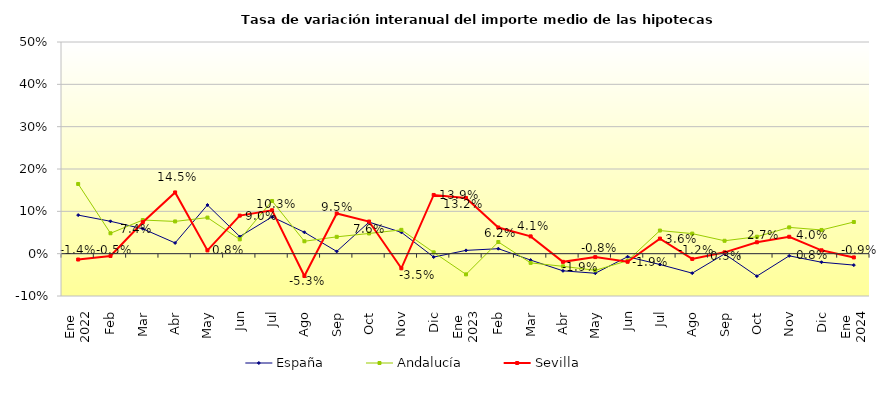
| Category | España | Andalucía | Sevilla |
|---|---|---|---|
| 0 | 0.091 | 0.165 | -0.014 |
| 1 | 0.076 | 0.048 | -0.005 |
| 2 | 0.059 | 0.079 | 0.074 |
| 3 | 0.025 | 0.076 | 0.145 |
| 4 | 0.115 | 0.085 | 0.008 |
| 5 | 0.04 | 0.034 | 0.09 |
| 6 | 0.087 | 0.124 | 0.103 |
| 7 | 0.051 | 0.029 | -0.053 |
| 8 | 0.005 | 0.04 | 0.095 |
| 9 | 0.074 | 0.048 | 0.076 |
| 10 | 0.051 | 0.056 | -0.035 |
| 11 | -0.008 | 0.003 | 0.139 |
| 12 | 0.008 | -0.049 | 0.132 |
| 13 | 0.012 | 0.028 | 0.062 |
| 14 | -0.015 | -0.022 | 0.041 |
| 15 | -0.041 | -0.03 | -0.019 |
| 16 | -0.046 | -0.039 | -0.008 |
| 17 | -0.007 | -0.017 | -0.019 |
| 18 | -0.026 | 0.055 | 0.036 |
| 19 | -0.046 | 0.047 | -0.012 |
| 20 | -0.001 | 0.03 | 0.003 |
| 21 | -0.053 | 0.04 | 0.027 |
| 22 | -0.005 | 0.062 | 0.04 |
| 23 | -0.02 | 0.056 | 0.008 |
| 24 | -0.027 | 0.075 | -0.009 |